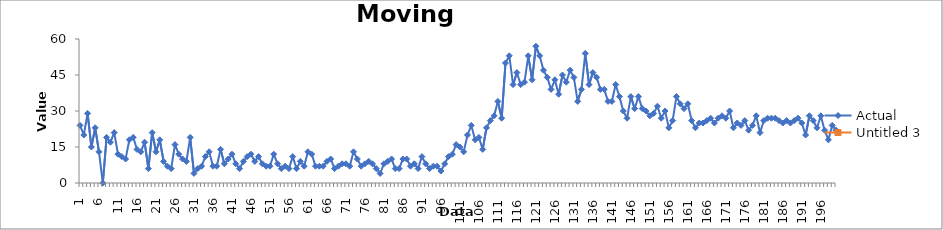
| Category | Actual | Untitled 3 |
|---|---|---|
| 0 | 24 |  |
| 1 | 20 |  |
| 2 | 29 |  |
| 3 | 15 |  |
| 4 | 23 |  |
| 5 | 13 |  |
| 6 | 0 |  |
| 7 | 19 |  |
| 8 | 17 |  |
| 9 | 21 |  |
| 10 | 12 |  |
| 11 | 11 |  |
| 12 | 10 |  |
| 13 | 18 |  |
| 14 | 19 |  |
| 15 | 14 |  |
| 16 | 13 |  |
| 17 | 17 |  |
| 18 | 6 |  |
| 19 | 21 |  |
| 20 | 13 |  |
| 21 | 18 |  |
| 22 | 9 |  |
| 23 | 7 |  |
| 24 | 6 |  |
| 25 | 16 |  |
| 26 | 12 |  |
| 27 | 10 |  |
| 28 | 9 |  |
| 29 | 19 |  |
| 30 | 4 |  |
| 31 | 6 |  |
| 32 | 7 |  |
| 33 | 11 |  |
| 34 | 13 |  |
| 35 | 7 |  |
| 36 | 7 |  |
| 37 | 14 |  |
| 38 | 8 |  |
| 39 | 10 |  |
| 40 | 12 |  |
| 41 | 8 |  |
| 42 | 6 |  |
| 43 | 9 |  |
| 44 | 11 |  |
| 45 | 12 |  |
| 46 | 9 |  |
| 47 | 11 |  |
| 48 | 8 |  |
| 49 | 7 |  |
| 50 | 7 |  |
| 51 | 12 |  |
| 52 | 8 |  |
| 53 | 6 |  |
| 54 | 7 |  |
| 55 | 6 |  |
| 56 | 11 |  |
| 57 | 6 |  |
| 58 | 9 |  |
| 59 | 7 |  |
| 60 | 13 |  |
| 61 | 12 |  |
| 62 | 7 |  |
| 63 | 7 |  |
| 64 | 7 |  |
| 65 | 9 |  |
| 66 | 10 |  |
| 67 | 6 |  |
| 68 | 7 |  |
| 69 | 8 |  |
| 70 | 8 |  |
| 71 | 7 |  |
| 72 | 13 |  |
| 73 | 10 |  |
| 74 | 7 |  |
| 75 | 8 |  |
| 76 | 9 |  |
| 77 | 8 |  |
| 78 | 6 |  |
| 79 | 4 |  |
| 80 | 8 |  |
| 81 | 9 |  |
| 82 | 10 |  |
| 83 | 6 |  |
| 84 | 6 |  |
| 85 | 10 |  |
| 86 | 10 |  |
| 87 | 7 |  |
| 88 | 8 |  |
| 89 | 6 |  |
| 90 | 11 |  |
| 91 | 8 |  |
| 92 | 6 |  |
| 93 | 7 |  |
| 94 | 7 |  |
| 95 | 5 |  |
| 96 | 8 |  |
| 97 | 11 |  |
| 98 | 12 |  |
| 99 | 16 |  |
| 100 | 15 |  |
| 101 | 13 |  |
| 102 | 20 |  |
| 103 | 24 |  |
| 104 | 18 |  |
| 105 | 19 |  |
| 106 | 14 |  |
| 107 | 23 |  |
| 108 | 26 |  |
| 109 | 28 |  |
| 110 | 34 |  |
| 111 | 27 |  |
| 112 | 50 |  |
| 113 | 53 |  |
| 114 | 41 |  |
| 115 | 46 |  |
| 116 | 41 |  |
| 117 | 42 |  |
| 118 | 53 |  |
| 119 | 43 |  |
| 120 | 57 |  |
| 121 | 53 |  |
| 122 | 47 |  |
| 123 | 44 |  |
| 124 | 39 |  |
| 125 | 43 |  |
| 126 | 37 |  |
| 127 | 45 |  |
| 128 | 42 |  |
| 129 | 47 |  |
| 130 | 44 |  |
| 131 | 34 |  |
| 132 | 39 |  |
| 133 | 54 |  |
| 134 | 41 |  |
| 135 | 46 |  |
| 136 | 44 |  |
| 137 | 39 |  |
| 138 | 39 |  |
| 139 | 34 |  |
| 140 | 34 |  |
| 141 | 41 |  |
| 142 | 36 |  |
| 143 | 30 |  |
| 144 | 27 |  |
| 145 | 36 |  |
| 146 | 31 |  |
| 147 | 36 |  |
| 148 | 31 |  |
| 149 | 30 |  |
| 150 | 28 |  |
| 151 | 29 |  |
| 152 | 32 |  |
| 153 | 27 |  |
| 154 | 30 |  |
| 155 | 23 |  |
| 156 | 26 |  |
| 157 | 36 |  |
| 158 | 33 |  |
| 159 | 31 |  |
| 160 | 33 |  |
| 161 | 26 |  |
| 162 | 23 |  |
| 163 | 25 |  |
| 164 | 25 |  |
| 165 | 26 |  |
| 166 | 27 |  |
| 167 | 25 |  |
| 168 | 27 |  |
| 169 | 28 |  |
| 170 | 27 |  |
| 171 | 30 |  |
| 172 | 23 |  |
| 173 | 25 |  |
| 174 | 24 |  |
| 175 | 26 |  |
| 176 | 22 |  |
| 177 | 24 |  |
| 178 | 28 |  |
| 179 | 21 |  |
| 180 | 26 |  |
| 181 | 27 |  |
| 182 | 27 |  |
| 183 | 27 |  |
| 184 | 26 |  |
| 185 | 25 |  |
| 186 | 26 |  |
| 187 | 25 |  |
| 188 | 26 |  |
| 189 | 27 |  |
| 190 | 25 |  |
| 191 | 20 |  |
| 192 | 28 |  |
| 193 | 26 |  |
| 194 | 23 |  |
| 195 | 28 |  |
| 196 | 22 |  |
| 197 | 18 |  |
| 198 | 24 |  |
| 199 | 22 |  |